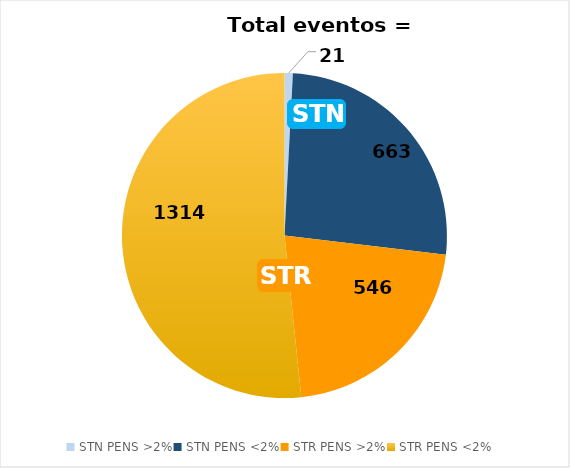
| Category | eventos |
|---|---|
| STN PENS >2% | 21 |
| STN PENS <2% | 663 |
| STR PENS >2% | 546 |
| STR PENS <2% | 1314 |